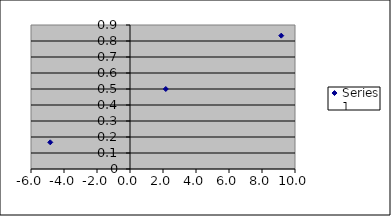
| Category | Series 0 |
|---|---|
| 9.166666666666668 | 0.833 |
| -4.833333333333335 | 0.167 |
| 2.166666666666664 | 0.5 |